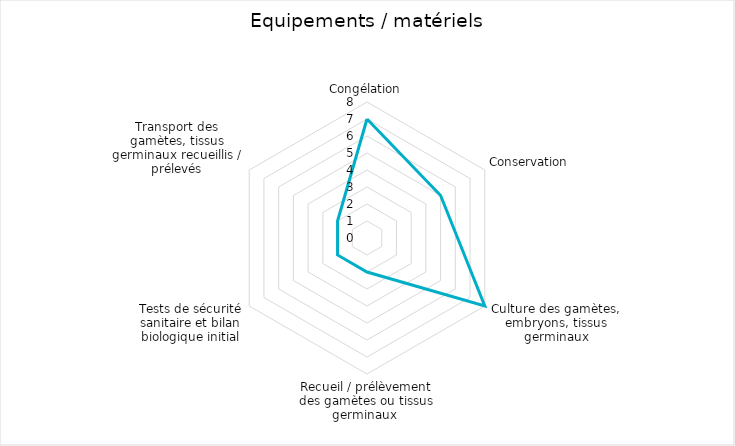
| Category | Series 0 |
|---|---|
| Congélation | 7 |
| Conservation | 5 |
| Culture des gamètes, embryons, tissus germinaux | 8 |
| Recueil / prélèvement des gamètes ou tissus germinaux  | 2 |
| Tests de sécurité sanitaire et bilan biologique initial | 2 |
| Transport des gamètes, tissus germinaux recueillis / prélevés | 2 |